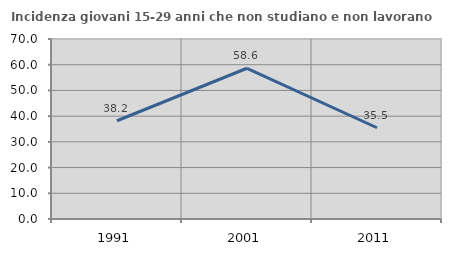
| Category | Incidenza giovani 15-29 anni che non studiano e non lavorano  |
|---|---|
| 1991.0 | 38.206 |
| 2001.0 | 58.621 |
| 2011.0 | 35.484 |